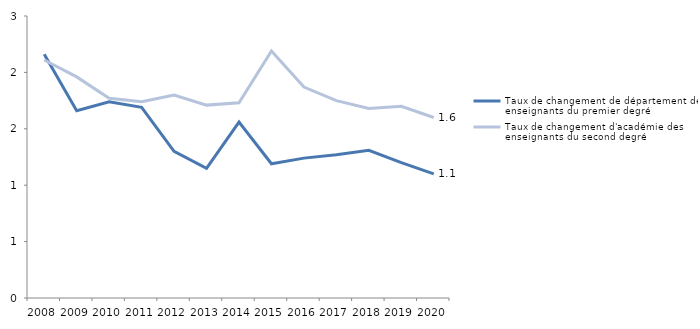
| Category | Taux de changement de département des enseignants du premier degré | Taux de changement d'académie des enseignants du second degré |
|---|---|---|
| 2008 | 2.16 | 2.11 |
| 2009 | 1.66 | 1.96 |
| 2010 | 1.74 | 1.77 |
| 2011 | 1.69 | 1.74 |
| 2012 | 1.3 | 1.8 |
| 2013 | 1.15 | 1.71 |
| 2014 | 1.56 | 1.73 |
| 2015 | 1.19 | 2.19 |
| 2016 | 1.24 | 1.87 |
| 2017 | 1.27 | 1.75 |
| 2018 | 1.31 | 1.68 |
| 2019 | 1.2 | 1.7 |
| 2020 | 1.1 | 1.6 |